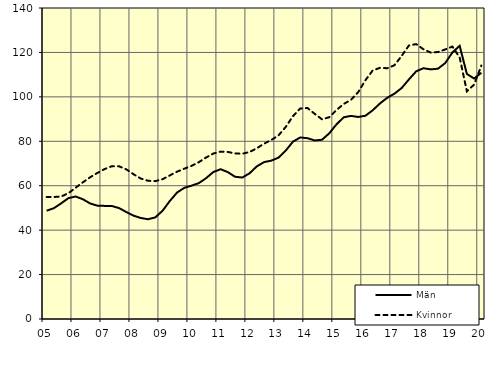
| Category | Män | Kvinnor |
|---|---|---|
| 5.0 | 48.74 | 54.88 |
| nan | 49.89 | 54.92 |
| 6.0 | 52.05 | 55.14 |
| 6.0 | 54.4 | 56.61 |
| 6.0 | 55.15 | 59.08 |
| nan | 53.91 | 61.53 |
| 7.0 | 52.02 | 63.79 |
| 7.0 | 51.02 | 65.75 |
| 7.0 | 50.92 | 67.48 |
| nan | 50.87 | 68.79 |
| 8.0 | 49.93 | 68.73 |
| 8.0 | 48.16 | 67.37 |
| 8.0 | 46.52 | 65.17 |
| nan | 45.47 | 63.23 |
| 9.0 | 44.91 | 62.22 |
| 9.0 | 45.73 | 62.06 |
| 9.0 | 48.73 | 62.93 |
| nan | 53.1 | 64.63 |
| 10.0 | 56.93 | 66.32 |
| 10.0 | 59.04 | 67.67 |
| 10.0 | 60.03 | 68.92 |
| nan | 61.17 | 70.59 |
| 11.0 | 63.37 | 72.68 |
| 11.0 | 66.14 | 74.48 |
| 11.0 | 67.43 | 75.35 |
| nan | 66.13 | 75.2 |
| 12.0 | 64.04 | 74.55 |
| 12.0 | 63.68 | 74.38 |
| 12.0 | 65.57 | 75.17 |
| nan | 68.68 | 76.85 |
| 13.0 | 70.62 | 78.91 |
| 13.0 | 71.28 | 80.56 |
| 13.0 | 72.64 | 82.65 |
| nan | 75.81 | 86.46 |
| 14.0 | 79.85 | 91.31 |
| 14.0 | 81.72 | 94.75 |
| 14.0 | 81.39 | 95 |
| nan | 80.38 | 92.34 |
| 15.0 | 80.68 | 89.91 |
| 15.0 | 83.56 | 90.82 |
| 15.0 | 87.61 | 94.06 |
| nan | 90.8 | 96.8 |
| 16.0 | 91.43 | 98.65 |
| 16.0 | 90.95 | 102.13 |
| 16.0 | 91.5 | 107.49 |
| nan | 93.95 | 111.89 |
| 17.0 | 97.02 | 113.07 |
| 17.0 | 99.57 | 112.88 |
| 17.0 | 101.43 | 114.22 |
| nan | 103.98 | 118.43 |
| 18.0 | 107.84 | 123.14 |
| 18.0 | 111.49 | 123.75 |
| 18.0 | 112.9 | 121.42 |
| nan | 112.37 | 119.94 |
| 19.0 | 112.67 | 120.18 |
| 19.0 | 115.17 | 121.33 |
| 19.0 | 119.98 | 122.65 |
| nan | 122.98 | 117.79 |
| 20.0 | 110.3 | 102.48 |
| 20.0 | 108.25 | 105.52 |
| 20.0 | 110.85 | 114.11 |